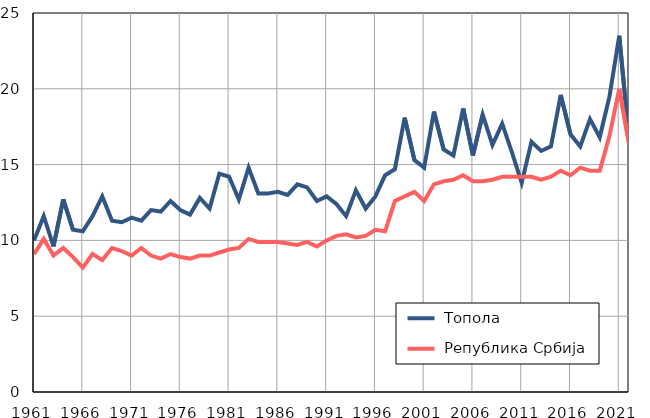
| Category |  Топола |  Република Србија |
|---|---|---|
| 1961.0 | 10 | 9.1 |
| 1962.0 | 11.6 | 10.1 |
| 1963.0 | 9.6 | 9 |
| 1964.0 | 12.7 | 9.5 |
| 1965.0 | 10.7 | 8.9 |
| 1966.0 | 10.6 | 8.2 |
| 1967.0 | 11.6 | 9.1 |
| 1968.0 | 12.9 | 8.7 |
| 1969.0 | 11.3 | 9.5 |
| 1970.0 | 11.2 | 9.3 |
| 1971.0 | 11.5 | 9 |
| 1972.0 | 11.3 | 9.5 |
| 1973.0 | 12 | 9 |
| 1974.0 | 11.9 | 8.8 |
| 1975.0 | 12.6 | 9.1 |
| 1976.0 | 12 | 8.9 |
| 1977.0 | 11.7 | 8.8 |
| 1978.0 | 12.8 | 9 |
| 1979.0 | 12.1 | 9 |
| 1980.0 | 14.4 | 9.2 |
| 1981.0 | 14.2 | 9.4 |
| 1982.0 | 12.7 | 9.5 |
| 1983.0 | 14.8 | 10.1 |
| 1984.0 | 13.1 | 9.9 |
| 1985.0 | 13.1 | 9.9 |
| 1986.0 | 13.2 | 9.9 |
| 1987.0 | 13 | 9.8 |
| 1988.0 | 13.7 | 9.7 |
| 1989.0 | 13.5 | 9.9 |
| 1990.0 | 12.6 | 9.6 |
| 1991.0 | 12.9 | 10 |
| 1992.0 | 12.4 | 10.3 |
| 1993.0 | 11.6 | 10.4 |
| 1994.0 | 13.3 | 10.2 |
| 1995.0 | 12.1 | 10.3 |
| 1996.0 | 12.9 | 10.7 |
| 1997.0 | 14.3 | 10.6 |
| 1998.0 | 14.7 | 12.6 |
| 1999.0 | 18.1 | 12.9 |
| 2000.0 | 15.3 | 13.2 |
| 2001.0 | 14.8 | 12.6 |
| 2002.0 | 18.5 | 13.7 |
| 2003.0 | 16 | 13.9 |
| 2004.0 | 15.6 | 14 |
| 2005.0 | 18.7 | 14.3 |
| 2006.0 | 15.6 | 13.9 |
| 2007.0 | 18.3 | 13.9 |
| 2008.0 | 16.3 | 14 |
| 2009.0 | 17.7 | 14.2 |
| 2010.0 | 15.8 | 14.2 |
| 2011.0 | 13.8 | 14.2 |
| 2012.0 | 16.5 | 14.2 |
| 2013.0 | 15.9 | 14 |
| 2014.0 | 16.2 | 14.2 |
| 2015.0 | 19.6 | 14.6 |
| 2016.0 | 17 | 14.3 |
| 2017.0 | 16.2 | 14.8 |
| 2018.0 | 18 | 14.6 |
| 2019.0 | 16.8 | 14.6 |
| 2020.0 | 19.5 | 16.9 |
| 2021.0 | 23.5 | 20 |
| 2022.0 | 16.7 | 16.4 |